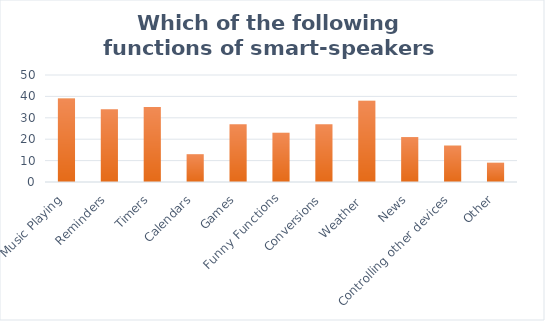
| Category | Series 0 |
|---|---|
| Music Playing | 39 |
| Reminders | 34 |
| Timers | 35 |
| Calendars | 13 |
| Games | 27 |
| Funny Functions | 23 |
| Conversions | 27 |
| Weather  | 38 |
| News | 21 |
| Controlling other devices | 17 |
| Other | 9 |